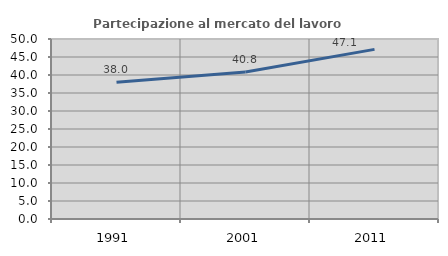
| Category | Partecipazione al mercato del lavoro  femminile |
|---|---|
| 1991.0 | 38.006 |
| 2001.0 | 40.813 |
| 2011.0 | 47.124 |